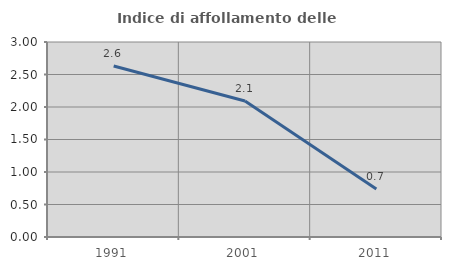
| Category | Indice di affollamento delle abitazioni  |
|---|---|
| 1991.0 | 2.632 |
| 2001.0 | 2.091 |
| 2011.0 | 0.738 |